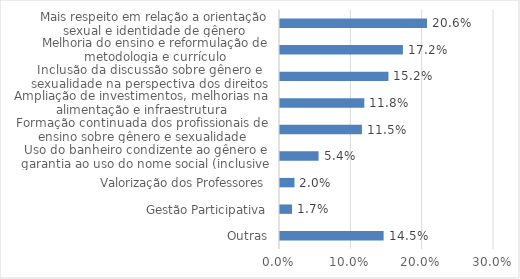
| Category | Series 0 |
|---|---|
| Outras | 0.145 |
| Gestão Participativa | 0.017 |
| Valorização dos Professores | 0.02 |
| Uso do banheiro condizente ao gênero e garantia ao uso do nome social (inclusive em documentação) | 0.054 |
| Formação continuada dos profissionais de ensino sobre gênero e sexualidade | 0.115 |
| Ampliação de investimentos, melhorias na alimentação e infraestrutura | 0.118 |
| Inclusão da discussão sobre gênero e sexualidade na perspectiva dos direitos humanos | 0.152 |
| Melhoria do ensino e reformulação de metodologia e currículo | 0.172 |
| Mais respeito em relação a orientação sexual e identidade de gênero | 0.206 |